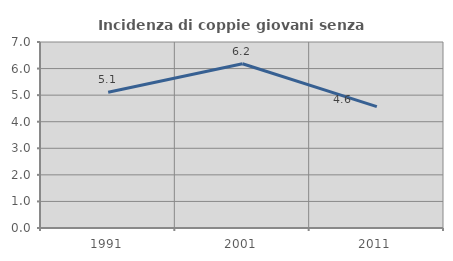
| Category | Incidenza di coppie giovani senza figli |
|---|---|
| 1991.0 | 5.11 |
| 2001.0 | 6.183 |
| 2011.0 | 4.567 |